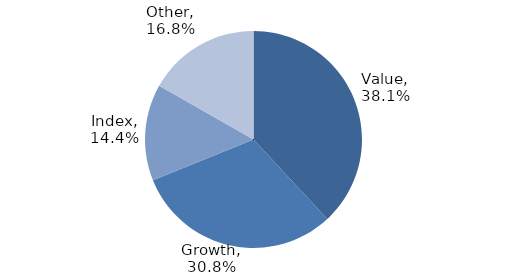
| Category | Investment Style |
|---|---|
| Value | 0.381 |
| Growth | 0.308 |
| Index | 0.144 |
| Other | 0.168 |